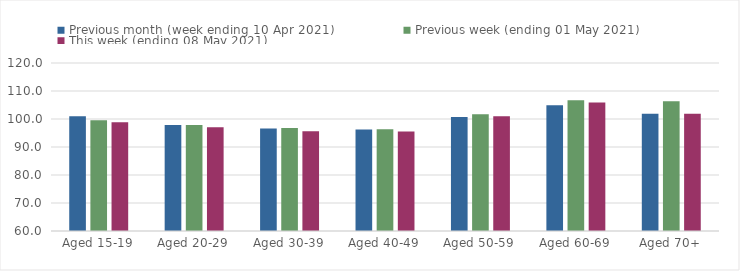
| Category | Previous month (week ending 10 Apr 2021) | Previous week (ending 01 May 2021) | This week (ending 08 May 2021) |
|---|---|---|---|
| Aged 15-19 | 100.99 | 99.56 | 98.81 |
| Aged 20-29 | 97.85 | 97.89 | 97.03 |
| Aged 30-39 | 96.61 | 96.8 | 95.62 |
| Aged 40-49 | 96.29 | 96.35 | 95.5 |
| Aged 50-59 | 100.71 | 101.66 | 100.98 |
| Aged 60-69 | 104.87 | 106.69 | 105.89 |
| Aged 70+ | 101.89 | 106.31 | 101.91 |